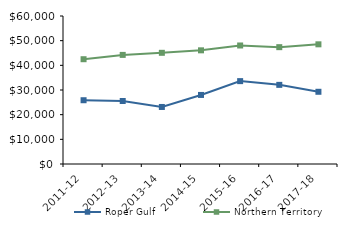
| Category | Roper Gulf | Northern Territory |
|---|---|---|
| 2011-12 | 25855.29 | 42481 |
| 2012-13 | 25550 | 44232.02 |
| 2013-14 | 23121.28 | 45075.51 |
| 2014-15 | 27994.31 | 46083.65 |
| 2015-16 | 33597.5 | 48046.27 |
| 2016-17 | 32081.75 | 47367.05 |
| 2017-18 | 29277.2 | 48519 |